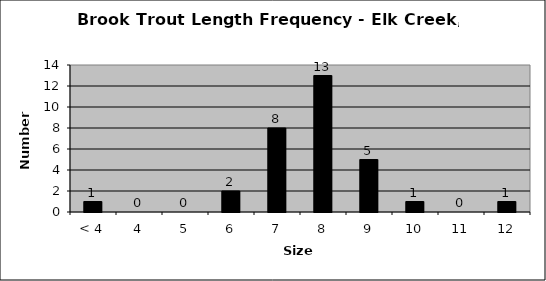
| Category | Series 0 |
|---|---|
| < 4 | 1 |
| 4 | 0 |
| 5 | 0 |
| 6 | 2 |
| 7 | 8 |
| 8 | 13 |
| 9 | 5 |
| 10 | 1 |
| 11 | 0 |
| 12 | 1 |